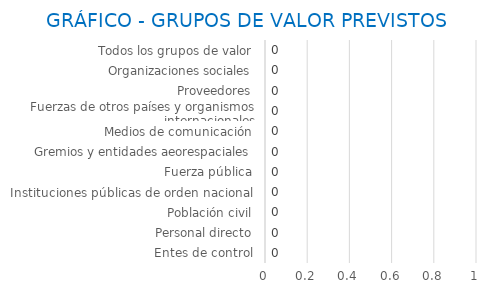
| Category | Series 0 |
|---|---|
| Entes de control | 0 |
| Personal directo | 0 |
| Población civil | 0 |
| Instituciones públicas de orden nacional | 0 |
| Fuerza pública | 0 |
| Gremios y entidades aeorespaciales | 0 |
| Medios de comunicación | 0 |
| Fuerzas de otros países y organismos internacionales | 0 |
| Proveedores | 0 |
| Organizaciones sociales | 0 |
| Todos los grupos de valor | 0 |